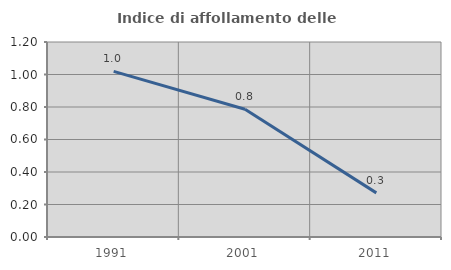
| Category | Indice di affollamento delle abitazioni  |
|---|---|
| 1991.0 | 1.019 |
| 2001.0 | 0.787 |
| 2011.0 | 0.271 |